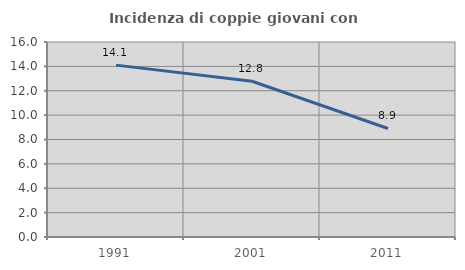
| Category | Incidenza di coppie giovani con figli |
|---|---|
| 1991.0 | 14.103 |
| 2001.0 | 12.778 |
| 2011.0 | 8.905 |